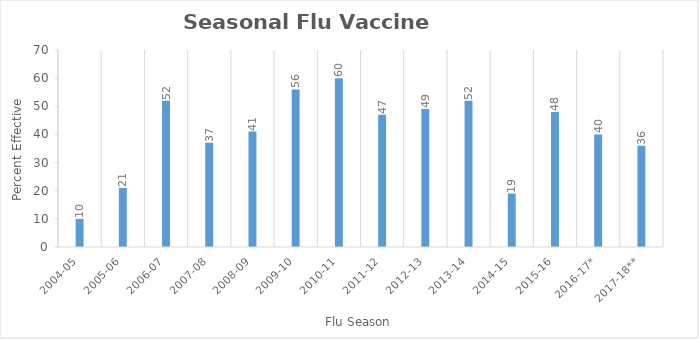
| Category | Series 0 |
|---|---|
| 2004-05 | 10 |
| 2005-06 | 21 |
| 2006-07 | 52 |
| 2007-08 | 37 |
| 2008-09 | 41 |
| 2009-10 | 56 |
| 2010-11 | 60 |
| 2011-12 | 47 |
| 2012-13 | 49 |
| 2013-14 | 52 |
| 2014-15 | 19 |
| 2015-16 | 48 |
| 2016-17* | 40 |
| 2017-18** | 36 |